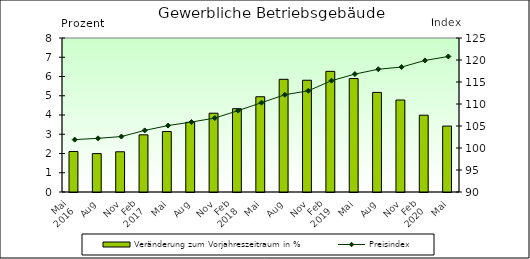
| Category | Veränderung zum Vorjahreszeitraum in % |
|---|---|
| 0 | 2.104 |
| 1 | 1.996 |
| 2 | 2.09 |
| 3 | 2.97 |
| 4 | 3.14 |
| 5 | 3.62 |
| 6 | 4.094 |
| 7 | 4.327 |
| 8 | 4.948 |
| 9 | 5.855 |
| 10 | 5.805 |
| 11 | 6.267 |
| 12 | 5.893 |
| 13 | 5.174 |
| 14 | 4.779 |
| 15 | 3.99 |
| 16 | 3.425 |